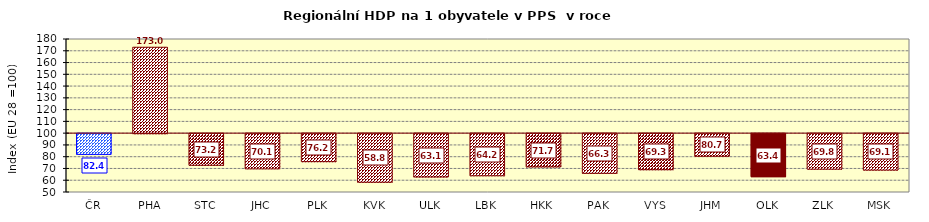
| Category | Series 1 |
|---|---|
| ČR | 82.384 |
| PHA | 172.992 |
| STC | 73.157 |
| JHC | 70.091 |
| PLK | 76.194 |
| KVK | 58.758 |
| ULK | 63.15 |
| LBK | 64.248 |
| HKK | 71.722 |
| PAK | 66.313 |
| VYS | 69.331 |
| JHM | 80.737 |
| OLK | 63.436 |
| ZLK | 69.804 |
| MSK | 69.075 |